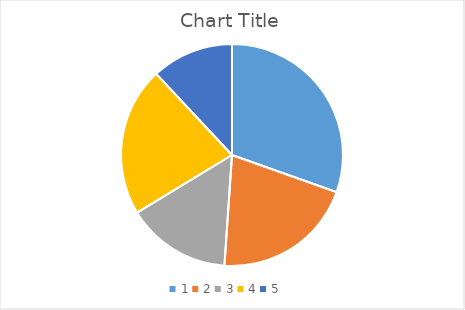
| Category | Series 0 |
|---|---|
| 0 | 30.435 |
| 1 | 20.652 |
| 2 | 15.217 |
| 3 | 21.739 |
| 4 | 11.957 |